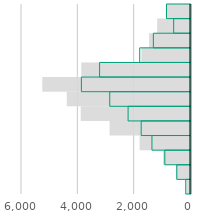
| Category | 2010 | 2020 |
|---|---|---|
| Moins de 25 ans | -126 | -169 |
| [25-30 ans) | -492 | -487 |
| [30-35 ans) | -957 | -912 |
| [35-40 ans) | -1789 | -1369 |
| [40-45 ans) | -2854 | -1751 |
| [45-50 ans) | -3880 | -2216 |
| [50-55 ans) | -4374 | -2867 |
| [55-60 ans) | -5244 | -3874 |
| [60-65 ans) | -3859 | -3227 |
| [65-70 ans) | -1725 | -1803 |
| [70-75 ans) | -1453 | -1319 |
| [75-80 ans) | -1167 | -598 |
| 80 ans ou plus | -858 | -851 |